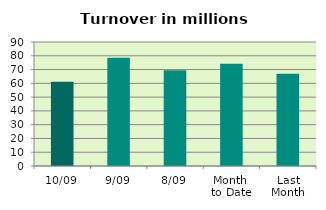
| Category | Series 0 |
|---|---|
| 10/09 | 61.169 |
| 9/09 | 78.595 |
| 8/09 | 69.476 |
| Month 
to Date | 74.289 |
| Last
Month | 66.948 |